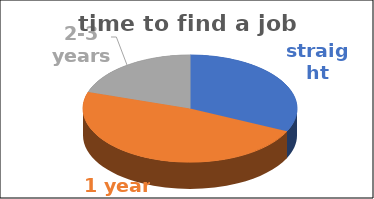
| Category | time to find a job | Series 1 | Series 2 | Series 3 | Series 4 |
|---|---|---|---|---|---|
| straight away | 0.32 |  |  |  |  |
| 1 year | 0.48 |  |  |  |  |
| 2-3 years | 0.2 |  |  |  |  |